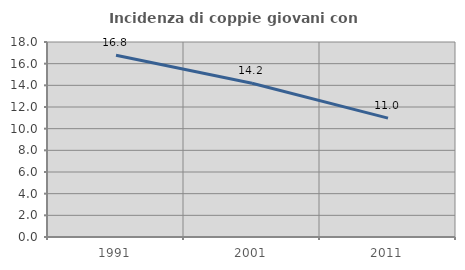
| Category | Incidenza di coppie giovani con figli |
|---|---|
| 1991.0 | 16.783 |
| 2001.0 | 14.194 |
| 2011.0 | 10.976 |